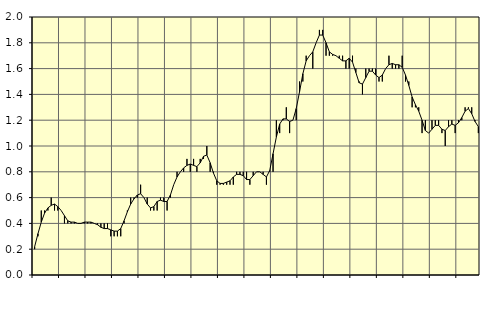
| Category | Piggar | Anställda utomlands |
|---|---|---|
| nan | 0.2 | 0.22 |
| 87.0 | 0.3 | 0.32 |
| 87.0 | 0.5 | 0.41 |
| 87.0 | 0.5 | 0.48 |
| nan | 0.5 | 0.52 |
| 88.0 | 0.6 | 0.54 |
| 88.0 | 0.5 | 0.55 |
| 88.0 | 0.5 | 0.53 |
| nan | 0.5 | 0.5 |
| 89.0 | 0.4 | 0.46 |
| 89.0 | 0.4 | 0.42 |
| 89.0 | 0.4 | 0.41 |
| nan | 0.4 | 0.41 |
| 90.0 | 0.4 | 0.4 |
| 90.0 | 0.4 | 0.4 |
| 90.0 | 0.4 | 0.41 |
| nan | 0.4 | 0.41 |
| 91.0 | 0.4 | 0.41 |
| 91.0 | 0.4 | 0.4 |
| 91.0 | 0.4 | 0.39 |
| nan | 0.4 | 0.37 |
| 92.0 | 0.4 | 0.36 |
| 92.0 | 0.4 | 0.36 |
| 92.0 | 0.3 | 0.35 |
| nan | 0.3 | 0.34 |
| 93.0 | 0.3 | 0.34 |
| 93.0 | 0.3 | 0.36 |
| 93.0 | 0.4 | 0.42 |
| nan | 0.5 | 0.49 |
| 94.0 | 0.6 | 0.55 |
| 94.0 | 0.6 | 0.59 |
| 94.0 | 0.6 | 0.62 |
| nan | 0.7 | 0.63 |
| 95.0 | 0.6 | 0.6 |
| 95.0 | 0.6 | 0.55 |
| 95.0 | 0.5 | 0.52 |
| nan | 0.5 | 0.53 |
| 96.0 | 0.5 | 0.57 |
| 96.0 | 0.6 | 0.58 |
| 96.0 | 0.6 | 0.57 |
| nan | 0.5 | 0.57 |
| 97.0 | 0.6 | 0.62 |
| 97.0 | 0.7 | 0.7 |
| 97.0 | 0.8 | 0.76 |
| nan | 0.8 | 0.8 |
| 98.0 | 0.8 | 0.83 |
| 98.0 | 0.9 | 0.85 |
| 98.0 | 0.8 | 0.86 |
| nan | 0.9 | 0.85 |
| 99.0 | 0.8 | 0.84 |
| 99.0 | 0.9 | 0.87 |
| 99.0 | 0.9 | 0.92 |
| nan | 1 | 0.93 |
| 0.0 | 0.8 | 0.87 |
| 0.0 | 0.8 | 0.79 |
| 0.0 | 0.7 | 0.73 |
| nan | 0.7 | 0.71 |
| 1.0 | 0.7 | 0.71 |
| 1.0 | 0.7 | 0.72 |
| 1.0 | 0.7 | 0.73 |
| nan | 0.7 | 0.76 |
| 2.0 | 0.8 | 0.78 |
| 2.0 | 0.8 | 0.78 |
| 2.0 | 0.8 | 0.77 |
| nan | 0.8 | 0.74 |
| 3.0 | 0.7 | 0.74 |
| 3.0 | 0.8 | 0.77 |
| 3.0 | 0.8 | 0.8 |
| nan | 0.8 | 0.8 |
| 4.0 | 0.8 | 0.78 |
| 4.0 | 0.7 | 0.76 |
| 4.0 | 0.8 | 0.81 |
| nan | 0.8 | 0.94 |
| 5.0 | 1.2 | 1.07 |
| 5.0 | 1.1 | 1.17 |
| 5.0 | 1.2 | 1.21 |
| nan | 1.3 | 1.21 |
| 6.0 | 1.1 | 1.19 |
| 6.0 | 1.2 | 1.2 |
| 6.0 | 1.2 | 1.29 |
| nan | 1.5 | 1.42 |
| 7.0 | 1.5 | 1.56 |
| 7.0 | 1.7 | 1.66 |
| 7.0 | 1.7 | 1.7 |
| nan | 1.6 | 1.73 |
| 8.0 | 1.8 | 1.8 |
| 8.0 | 1.9 | 1.86 |
| 8.0 | 1.9 | 1.86 |
| nan | 1.7 | 1.8 |
| 9.0 | 1.7 | 1.73 |
| 9.0 | 1.7 | 1.71 |
| 9.0 | 1.7 | 1.7 |
| nan | 1.7 | 1.68 |
| 10.0 | 1.7 | 1.66 |
| 10.0 | 1.6 | 1.66 |
| 10.0 | 1.6 | 1.68 |
| nan | 1.7 | 1.65 |
| 11.0 | 1.6 | 1.57 |
| 11.0 | 1.5 | 1.49 |
| 11.0 | 1.4 | 1.48 |
| nan | 1.6 | 1.53 |
| 12.0 | 1.6 | 1.58 |
| 12.0 | 1.6 | 1.58 |
| 12.0 | 1.6 | 1.55 |
| nan | 1.5 | 1.53 |
| 13.0 | 1.5 | 1.55 |
| 13.0 | 1.6 | 1.6 |
| 13.0 | 1.7 | 1.63 |
| nan | 1.6 | 1.64 |
| 14.0 | 1.6 | 1.63 |
| 14.0 | 1.6 | 1.63 |
| 14.0 | 1.7 | 1.61 |
| nan | 1.5 | 1.55 |
| 15.0 | 1.5 | 1.47 |
| 15.0 | 1.3 | 1.38 |
| 15.0 | 1.3 | 1.32 |
| nan | 1.3 | 1.27 |
| 16.0 | 1.1 | 1.2 |
| 16.0 | 1.2 | 1.12 |
| 16.0 | 1.1 | 1.1 |
| nan | 1.2 | 1.13 |
| 17.0 | 1.2 | 1.16 |
| 17.0 | 1.2 | 1.16 |
| 17.0 | 1.1 | 1.13 |
| nan | 1 | 1.12 |
| 18.0 | 1.2 | 1.15 |
| 18.0 | 1.2 | 1.17 |
| 18.0 | 1.1 | 1.16 |
| nan | 1.2 | 1.18 |
| 19.0 | 1.2 | 1.22 |
| 19.0 | 1.3 | 1.27 |
| 19.0 | 1.3 | 1.29 |
| nan | 1.3 | 1.25 |
| 20.0 | 1.2 | 1.19 |
| 20.0 | 1.1 | 1.15 |